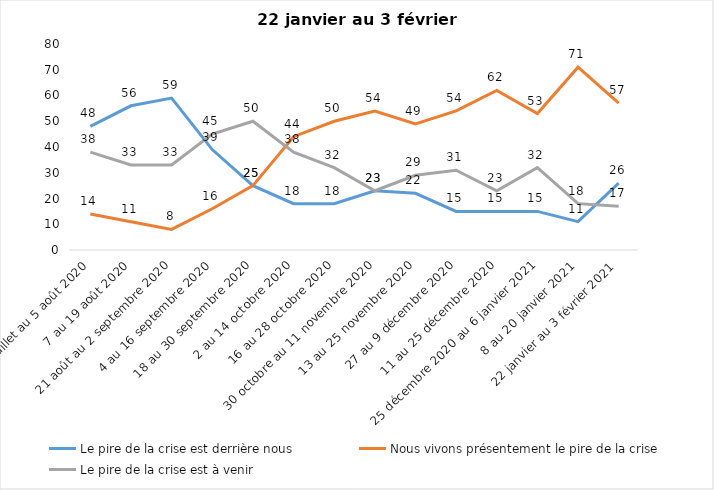
| Category | Le pire de la crise est derrière nous | Nous vivons présentement le pire de la crise | Le pire de la crise est à venir |
|---|---|---|---|
| 24 juillet au 5 août 2020 | 48 | 14 | 38 |
| 7 au 19 août 2020 | 56 | 11 | 33 |
| 21 août au 2 septembre 2020 | 59 | 8 | 33 |
| 4 au 16 septembre 2020 | 39 | 16 | 45 |
| 18 au 30 septembre 2020 | 25 | 25 | 50 |
| 2 au 14 octobre 2020 | 18 | 44 | 38 |
| 16 au 28 octobre 2020 | 18 | 50 | 32 |
| 30 octobre au 11 novembre 2020 | 23 | 54 | 23 |
| 13 au 25 novembre 2020 | 22 | 49 | 29 |
| 27 au 9 décembre 2020 | 15 | 54 | 31 |
| 11 au 25 décembre 2020 | 15 | 62 | 23 |
| 25 décembre 2020 au 6 janvier 2021 | 15 | 53 | 32 |
| 8 au 20 janvier 2021 | 11 | 71 | 18 |
| 22 janvier au 3 février 2021 | 26 | 57 | 17 |